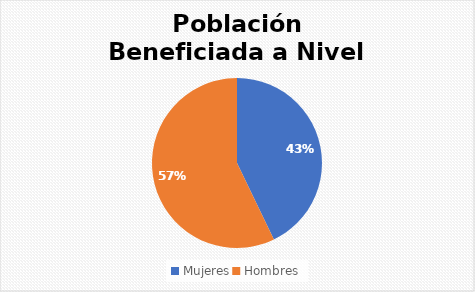
| Category | Series 0 |
|---|---|
| Mujeres | 6 |
| Hombres | 8 |